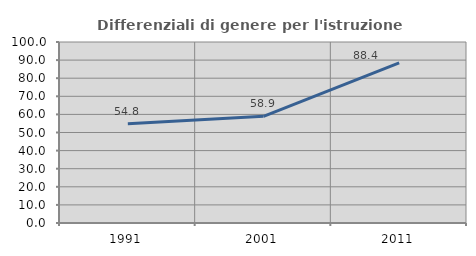
| Category | Differenziali di genere per l'istruzione superiore |
|---|---|
| 1991.0 | 54.85 |
| 2001.0 | 58.912 |
| 2011.0 | 88.413 |